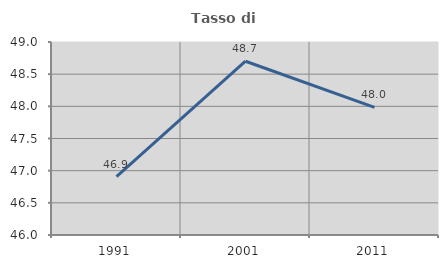
| Category | Tasso di occupazione   |
|---|---|
| 1991.0 | 46.908 |
| 2001.0 | 48.701 |
| 2011.0 | 47.984 |